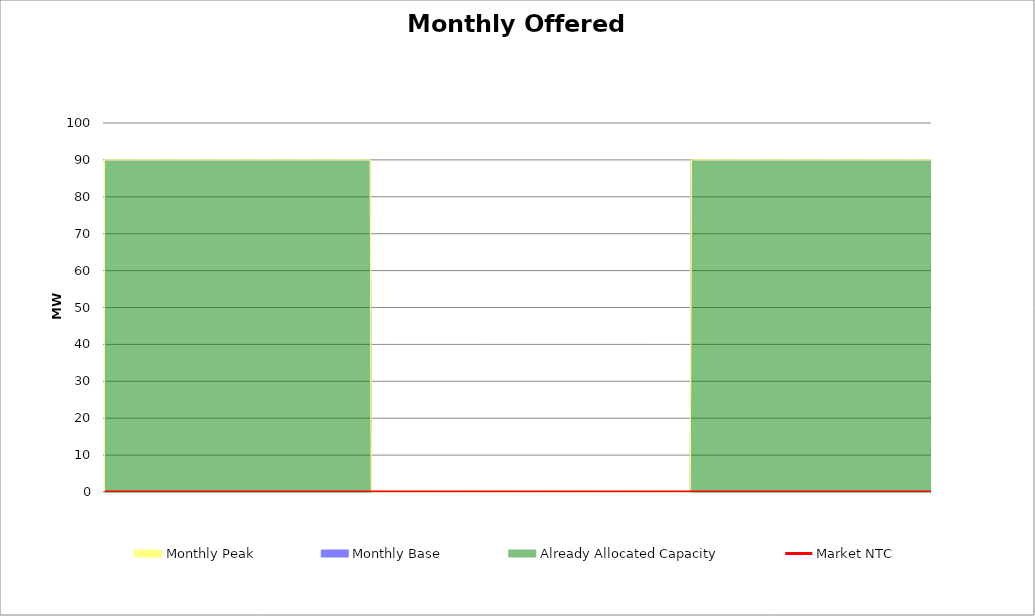
| Category | Market NTC |
|---|---|
| 0 | 0 |
| 1 | 0 |
| 2 | 0 |
| 3 | 0 |
| 4 | 0 |
| 5 | 0 |
| 6 | 0 |
| 7 | 0 |
| 8 | 0 |
| 9 | 0 |
| 10 | 0 |
| 11 | 0 |
| 12 | 0 |
| 13 | 0 |
| 14 | 0 |
| 15 | 0 |
| 16 | 0 |
| 17 | 0 |
| 18 | 0 |
| 19 | 0 |
| 20 | 0 |
| 21 | 0 |
| 22 | 0 |
| 23 | 0 |
| 24 | 0 |
| 25 | 0 |
| 26 | 0 |
| 27 | 0 |
| 28 | 0 |
| 29 | 0 |
| 30 | 0 |
| 31 | 0 |
| 32 | 0 |
| 33 | 0 |
| 34 | 0 |
| 35 | 0 |
| 36 | 0 |
| 37 | 0 |
| 38 | 0 |
| 39 | 0 |
| 40 | 0 |
| 41 | 0 |
| 42 | 0 |
| 43 | 0 |
| 44 | 0 |
| 45 | 0 |
| 46 | 0 |
| 47 | 0 |
| 48 | 0 |
| 49 | 0 |
| 50 | 0 |
| 51 | 0 |
| 52 | 0 |
| 53 | 0 |
| 54 | 0 |
| 55 | 0 |
| 56 | 0 |
| 57 | 0 |
| 58 | 0 |
| 59 | 0 |
| 60 | 0 |
| 61 | 0 |
| 62 | 0 |
| 63 | 0 |
| 64 | 0 |
| 65 | 0 |
| 66 | 0 |
| 67 | 0 |
| 68 | 0 |
| 69 | 0 |
| 70 | 0 |
| 71 | 0 |
| 72 | 0 |
| 73 | 0 |
| 74 | 0 |
| 75 | 0 |
| 76 | 0 |
| 77 | 0 |
| 78 | 0 |
| 79 | 0 |
| 80 | 0 |
| 81 | 0 |
| 82 | 0 |
| 83 | 0 |
| 84 | 0 |
| 85 | 0 |
| 86 | 0 |
| 87 | 0 |
| 88 | 0 |
| 89 | 0 |
| 90 | 0 |
| 91 | 0 |
| 92 | 0 |
| 93 | 0 |
| 94 | 0 |
| 95 | 0 |
| 96 | 0 |
| 97 | 0 |
| 98 | 0 |
| 99 | 0 |
| 100 | 0 |
| 101 | 0 |
| 102 | 0 |
| 103 | 0 |
| 104 | 0 |
| 105 | 0 |
| 106 | 0 |
| 107 | 0 |
| 108 | 0 |
| 109 | 0 |
| 110 | 0 |
| 111 | 0 |
| 112 | 0 |
| 113 | 0 |
| 114 | 0 |
| 115 | 0 |
| 116 | 0 |
| 117 | 0 |
| 118 | 0 |
| 119 | 0 |
| 120 | 0 |
| 121 | 0 |
| 122 | 0 |
| 123 | 0 |
| 124 | 0 |
| 125 | 0 |
| 126 | 0 |
| 127 | 0 |
| 128 | 0 |
| 129 | 0 |
| 130 | 0 |
| 131 | 0 |
| 132 | 0 |
| 133 | 0 |
| 134 | 0 |
| 135 | 0 |
| 136 | 0 |
| 137 | 0 |
| 138 | 0 |
| 139 | 0 |
| 140 | 0 |
| 141 | 0 |
| 142 | 0 |
| 143 | 0 |
| 144 | 0 |
| 145 | 0 |
| 146 | 0 |
| 147 | 0 |
| 148 | 0 |
| 149 | 0 |
| 150 | 0 |
| 151 | 0 |
| 152 | 0 |
| 153 | 0 |
| 154 | 0 |
| 155 | 0 |
| 156 | 0 |
| 157 | 0 |
| 158 | 0 |
| 159 | 0 |
| 160 | 0 |
| 161 | 0 |
| 162 | 0 |
| 163 | 0 |
| 164 | 0 |
| 165 | 0 |
| 166 | 0 |
| 167 | 0 |
| 168 | 0 |
| 169 | 0 |
| 170 | 0 |
| 171 | 0 |
| 172 | 0 |
| 173 | 0 |
| 174 | 0 |
| 175 | 0 |
| 176 | 0 |
| 177 | 0 |
| 178 | 0 |
| 179 | 0 |
| 180 | 0 |
| 181 | 0 |
| 182 | 0 |
| 183 | 0 |
| 184 | 0 |
| 185 | 0 |
| 186 | 0 |
| 187 | 0 |
| 188 | 0 |
| 189 | 0 |
| 190 | 0 |
| 191 | 0 |
| 192 | 0 |
| 193 | 0 |
| 194 | 0 |
| 195 | 0 |
| 196 | 0 |
| 197 | 0 |
| 198 | 0 |
| 199 | 0 |
| 200 | 0 |
| 201 | 0 |
| 202 | 0 |
| 203 | 0 |
| 204 | 0 |
| 205 | 0 |
| 206 | 0 |
| 207 | 0 |
| 208 | 0 |
| 209 | 0 |
| 210 | 0 |
| 211 | 0 |
| 212 | 0 |
| 213 | 0 |
| 214 | 0 |
| 215 | 0 |
| 216 | 0 |
| 217 | 0 |
| 218 | 0 |
| 219 | 0 |
| 220 | 0 |
| 221 | 0 |
| 222 | 0 |
| 223 | 0 |
| 224 | 0 |
| 225 | 0 |
| 226 | 0 |
| 227 | 0 |
| 228 | 0 |
| 229 | 0 |
| 230 | 0 |
| 231 | 0 |
| 232 | 0 |
| 233 | 0 |
| 234 | 0 |
| 235 | 0 |
| 236 | 0 |
| 237 | 0 |
| 238 | 0 |
| 239 | 0 |
| 240 | 0 |
| 241 | 0 |
| 242 | 0 |
| 243 | 0 |
| 244 | 0 |
| 245 | 0 |
| 246 | 0 |
| 247 | 0 |
| 248 | 0 |
| 249 | 0 |
| 250 | 0 |
| 251 | 0 |
| 252 | 0 |
| 253 | 0 |
| 254 | 0 |
| 255 | 0 |
| 256 | 0 |
| 257 | 0 |
| 258 | 0 |
| 259 | 0 |
| 260 | 0 |
| 261 | 0 |
| 262 | 0 |
| 263 | 0 |
| 264 | 0 |
| 265 | 0 |
| 266 | 0 |
| 267 | 0 |
| 268 | 0 |
| 269 | 0 |
| 270 | 0 |
| 271 | 0 |
| 272 | 0 |
| 273 | 0 |
| 274 | 0 |
| 275 | 0 |
| 276 | 0 |
| 277 | 0 |
| 278 | 0 |
| 279 | 0 |
| 280 | 0 |
| 281 | 0 |
| 282 | 0 |
| 283 | 0 |
| 284 | 0 |
| 285 | 0 |
| 286 | 0 |
| 287 | 0 |
| 288 | 0 |
| 289 | 0 |
| 290 | 0 |
| 291 | 0 |
| 292 | 0 |
| 293 | 0 |
| 294 | 0 |
| 295 | 0 |
| 296 | 0 |
| 297 | 0 |
| 298 | 0 |
| 299 | 0 |
| 300 | 0 |
| 301 | 0 |
| 302 | 0 |
| 303 | 0 |
| 304 | 0 |
| 305 | 0 |
| 306 | 0 |
| 307 | 0 |
| 308 | 0 |
| 309 | 0 |
| 310 | 0 |
| 311 | 0 |
| 312 | 0 |
| 313 | 0 |
| 314 | 0 |
| 315 | 0 |
| 316 | 0 |
| 317 | 0 |
| 318 | 0 |
| 319 | 0 |
| 320 | 0 |
| 321 | 0 |
| 322 | 0 |
| 323 | 0 |
| 324 | 0 |
| 325 | 0 |
| 326 | 0 |
| 327 | 0 |
| 328 | 0 |
| 329 | 0 |
| 330 | 0 |
| 331 | 0 |
| 332 | 0 |
| 333 | 0 |
| 334 | 0 |
| 335 | 0 |
| 336 | 0 |
| 337 | 0 |
| 338 | 0 |
| 339 | 0 |
| 340 | 0 |
| 341 | 0 |
| 342 | 0 |
| 343 | 0 |
| 344 | 0 |
| 345 | 0 |
| 346 | 0 |
| 347 | 0 |
| 348 | 0 |
| 349 | 0 |
| 350 | 0 |
| 351 | 0 |
| 352 | 0 |
| 353 | 0 |
| 354 | 0 |
| 355 | 0 |
| 356 | 0 |
| 357 | 0 |
| 358 | 0 |
| 359 | 0 |
| 360 | 0 |
| 361 | 0 |
| 362 | 0 |
| 363 | 0 |
| 364 | 0 |
| 365 | 0 |
| 366 | 0 |
| 367 | 0 |
| 368 | 0 |
| 369 | 0 |
| 370 | 0 |
| 371 | 0 |
| 372 | 0 |
| 373 | 0 |
| 374 | 0 |
| 375 | 0 |
| 376 | 0 |
| 377 | 0 |
| 378 | 0 |
| 379 | 0 |
| 380 | 0 |
| 381 | 0 |
| 382 | 0 |
| 383 | 0 |
| 384 | 0 |
| 385 | 0 |
| 386 | 0 |
| 387 | 0 |
| 388 | 0 |
| 389 | 0 |
| 390 | 0 |
| 391 | 0 |
| 392 | 0 |
| 393 | 0 |
| 394 | 0 |
| 395 | 0 |
| 396 | 0 |
| 397 | 0 |
| 398 | 0 |
| 399 | 0 |
| 400 | 0 |
| 401 | 0 |
| 402 | 0 |
| 403 | 0 |
| 404 | 0 |
| 405 | 0 |
| 406 | 0 |
| 407 | 0 |
| 408 | 0 |
| 409 | 0 |
| 410 | 0 |
| 411 | 0 |
| 412 | 0 |
| 413 | 0 |
| 414 | 0 |
| 415 | 0 |
| 416 | 0 |
| 417 | 0 |
| 418 | 0 |
| 419 | 0 |
| 420 | 0 |
| 421 | 0 |
| 422 | 0 |
| 423 | 0 |
| 424 | 0 |
| 425 | 0 |
| 426 | 0 |
| 427 | 0 |
| 428 | 0 |
| 429 | 0 |
| 430 | 0 |
| 431 | 0 |
| 432 | 0 |
| 433 | 0 |
| 434 | 0 |
| 435 | 0 |
| 436 | 0 |
| 437 | 0 |
| 438 | 0 |
| 439 | 0 |
| 440 | 0 |
| 441 | 0 |
| 442 | 0 |
| 443 | 0 |
| 444 | 0 |
| 445 | 0 |
| 446 | 0 |
| 447 | 0 |
| 448 | 0 |
| 449 | 0 |
| 450 | 0 |
| 451 | 0 |
| 452 | 0 |
| 453 | 0 |
| 454 | 0 |
| 455 | 0 |
| 456 | 0 |
| 457 | 0 |
| 458 | 0 |
| 459 | 0 |
| 460 | 0 |
| 461 | 0 |
| 462 | 0 |
| 463 | 0 |
| 464 | 0 |
| 465 | 0 |
| 466 | 0 |
| 467 | 0 |
| 468 | 0 |
| 469 | 0 |
| 470 | 0 |
| 471 | 0 |
| 472 | 0 |
| 473 | 0 |
| 474 | 0 |
| 475 | 0 |
| 476 | 0 |
| 477 | 0 |
| 478 | 0 |
| 479 | 0 |
| 480 | 0 |
| 481 | 0 |
| 482 | 0 |
| 483 | 0 |
| 484 | 0 |
| 485 | 0 |
| 486 | 0 |
| 487 | 0 |
| 488 | 0 |
| 489 | 0 |
| 490 | 0 |
| 491 | 0 |
| 492 | 0 |
| 493 | 0 |
| 494 | 0 |
| 495 | 0 |
| 496 | 0 |
| 497 | 0 |
| 498 | 0 |
| 499 | 0 |
| 500 | 0 |
| 501 | 0 |
| 502 | 0 |
| 503 | 0 |
| 504 | 0 |
| 505 | 0 |
| 506 | 0 |
| 507 | 0 |
| 508 | 0 |
| 509 | 0 |
| 510 | 0 |
| 511 | 0 |
| 512 | 0 |
| 513 | 0 |
| 514 | 0 |
| 515 | 0 |
| 516 | 0 |
| 517 | 0 |
| 518 | 0 |
| 519 | 0 |
| 520 | 0 |
| 521 | 0 |
| 522 | 0 |
| 523 | 0 |
| 524 | 0 |
| 525 | 0 |
| 526 | 0 |
| 527 | 0 |
| 528 | 0 |
| 529 | 0 |
| 530 | 0 |
| 531 | 0 |
| 532 | 0 |
| 533 | 0 |
| 534 | 0 |
| 535 | 0 |
| 536 | 0 |
| 537 | 0 |
| 538 | 0 |
| 539 | 0 |
| 540 | 0 |
| 541 | 0 |
| 542 | 0 |
| 543 | 0 |
| 544 | 0 |
| 545 | 0 |
| 546 | 0 |
| 547 | 0 |
| 548 | 0 |
| 549 | 0 |
| 550 | 0 |
| 551 | 0 |
| 552 | 0 |
| 553 | 0 |
| 554 | 0 |
| 555 | 0 |
| 556 | 0 |
| 557 | 0 |
| 558 | 0 |
| 559 | 0 |
| 560 | 0 |
| 561 | 0 |
| 562 | 0 |
| 563 | 0 |
| 564 | 0 |
| 565 | 0 |
| 566 | 0 |
| 567 | 0 |
| 568 | 0 |
| 569 | 0 |
| 570 | 0 |
| 571 | 0 |
| 572 | 0 |
| 573 | 0 |
| 574 | 0 |
| 575 | 0 |
| 576 | 0 |
| 577 | 0 |
| 578 | 0 |
| 579 | 0 |
| 580 | 0 |
| 581 | 0 |
| 582 | 0 |
| 583 | 0 |
| 584 | 0 |
| 585 | 0 |
| 586 | 0 |
| 587 | 0 |
| 588 | 0 |
| 589 | 0 |
| 590 | 0 |
| 591 | 0 |
| 592 | 0 |
| 593 | 0 |
| 594 | 0 |
| 595 | 0 |
| 596 | 0 |
| 597 | 0 |
| 598 | 0 |
| 599 | 0 |
| 600 | 0 |
| 601 | 0 |
| 602 | 0 |
| 603 | 0 |
| 604 | 0 |
| 605 | 0 |
| 606 | 0 |
| 607 | 0 |
| 608 | 0 |
| 609 | 0 |
| 610 | 0 |
| 611 | 0 |
| 612 | 0 |
| 613 | 0 |
| 614 | 0 |
| 615 | 0 |
| 616 | 0 |
| 617 | 0 |
| 618 | 0 |
| 619 | 0 |
| 620 | 0 |
| 621 | 0 |
| 622 | 0 |
| 623 | 0 |
| 624 | 0 |
| 625 | 0 |
| 626 | 0 |
| 627 | 0 |
| 628 | 0 |
| 629 | 0 |
| 630 | 0 |
| 631 | 0 |
| 632 | 0 |
| 633 | 0 |
| 634 | 0 |
| 635 | 0 |
| 636 | 0 |
| 637 | 0 |
| 638 | 0 |
| 639 | 0 |
| 640 | 0 |
| 641 | 0 |
| 642 | 0 |
| 643 | 0 |
| 644 | 0 |
| 645 | 0 |
| 646 | 0 |
| 647 | 0 |
| 648 | 0 |
| 649 | 0 |
| 650 | 0 |
| 651 | 0 |
| 652 | 0 |
| 653 | 0 |
| 654 | 0 |
| 655 | 0 |
| 656 | 0 |
| 657 | 0 |
| 658 | 0 |
| 659 | 0 |
| 660 | 0 |
| 661 | 0 |
| 662 | 0 |
| 663 | 0 |
| 664 | 0 |
| 665 | 0 |
| 666 | 0 |
| 667 | 0 |
| 668 | 0 |
| 669 | 0 |
| 670 | 0 |
| 671 | 0 |
| 672 | 0 |
| 673 | 0 |
| 674 | 0 |
| 675 | 0 |
| 676 | 0 |
| 677 | 0 |
| 678 | 0 |
| 679 | 0 |
| 680 | 0 |
| 681 | 0 |
| 682 | 0 |
| 683 | 0 |
| 684 | 0 |
| 685 | 0 |
| 686 | 0 |
| 687 | 0 |
| 688 | 0 |
| 689 | 0 |
| 690 | 0 |
| 691 | 0 |
| 692 | 0 |
| 693 | 0 |
| 694 | 0 |
| 695 | 0 |
| 696 | 0 |
| 697 | 0 |
| 698 | 0 |
| 699 | 0 |
| 700 | 0 |
| 701 | 0 |
| 702 | 0 |
| 703 | 0 |
| 704 | 0 |
| 705 | 0 |
| 706 | 0 |
| 707 | 0 |
| 708 | 0 |
| 709 | 0 |
| 710 | 0 |
| 711 | 0 |
| 712 | 0 |
| 713 | 0 |
| 714 | 0 |
| 715 | 0 |
| 716 | 0 |
| 717 | 0 |
| 718 | 0 |
| 719 | 0 |
| 720 | 0 |
| 721 | 0 |
| 722 | 0 |
| 723 | 0 |
| 724 | 0 |
| 725 | 0 |
| 726 | 0 |
| 727 | 0 |
| 728 | 0 |
| 729 | 0 |
| 730 | 0 |
| 731 | 0 |
| 732 | 0 |
| 733 | 0 |
| 734 | 0 |
| 735 | 0 |
| 736 | 0 |
| 737 | 0 |
| 738 | 0 |
| 739 | 0 |
| 740 | 0 |
| 741 | 0 |
| 742 | 0 |
| 743 | 0 |
| 744 | 0 |